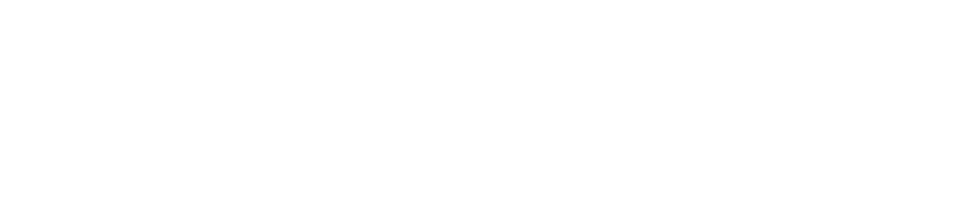
| Category | Series 0 |
|---|---|
| White Irish | 0 |
| Any Other White background | 0 |
| White & Black Caribbean | 0 |
| White & Black African | 0 |
| White & Asian | 0 |
| Any other mixed | 0 |
| Indian | 0 |
| Pakistani | 0 |
| Bangladeshi | 0 |
| Any other Asian | 0 |
| Caribbean | 0 |
| African | 0 |
| Any other Black Background | 0 |
| Chinese | 0 |
| Any other ethnic group | 0 |